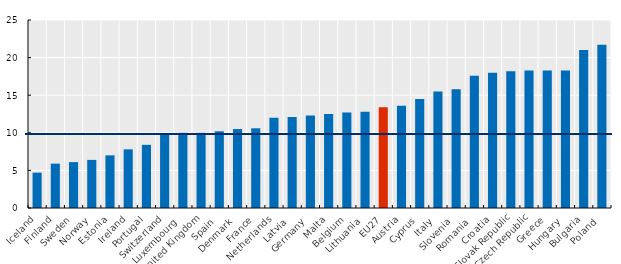
| Category | Series 0 |
|---|---|
| Iceland  | 4.7 |
| Finland  | 5.9 |
| Sweden  | 6.1 |
| Norway  | 6.4 |
| Estonia  | 7 |
| Ireland  | 7.8 |
| Portugal  | 8.4 |
| Switzerland  | 9.8 |
| Luxembourg  | 10 |
| United Kingdom  | 10 |
| Spain  | 10.2 |
| Denmark  | 10.5 |
| France  | 10.6 |
| Netherlands  | 12 |
| Latvia  | 12.1 |
| Germany  | 12.3 |
| Malta  | 12.5 |
| Belgium  | 12.7 |
| Lithuania  | 12.8 |
| EU27 | 13.396 |
| Austria  | 13.6 |
| Cyprus  | 14.5 |
| Italy  | 15.5 |
| Slovenia  | 15.8 |
| Romania  | 17.6 |
| Croatia  | 18 |
| Slovak Republic | 18.2 |
| Czech Republic | 18.3 |
| Greece  | 18.3 |
| Hungary  | 18.3 |
| Bulgaria  | 21 |
| Poland  | 21.7 |